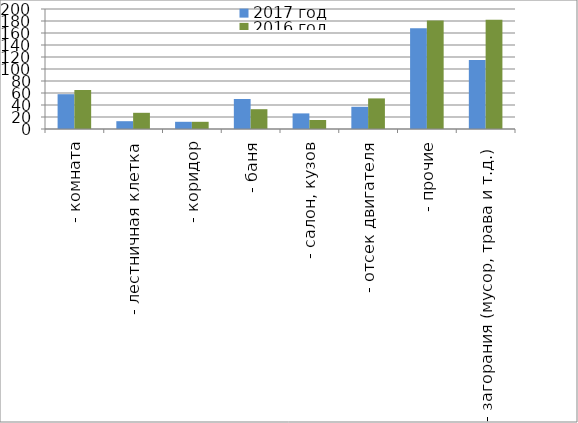
| Category | 2017 год | 2016 год |
|---|---|---|
|  - комната | 58 | 65 |
|  - лестничная клетка | 13 | 27 |
|  - коридор | 12 | 12 |
|  - баня | 50 | 33 |
|  - салон, кузов | 26 | 15 |
|  - отсек двигателя | 37 | 51 |
| - прочие | 168 | 181 |
| - загорания (мусор, трава и т.д.)  | 115 | 182 |